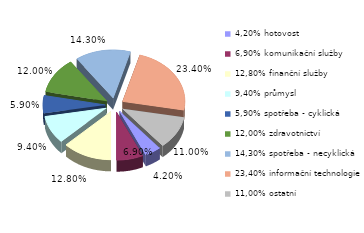
| Category | Series 0 |
|---|---|
| 4,20% hotovost | 0.042 |
| 6,90% komunikační služby | 0.069 |
| 12,80% finanční služby | 0.128 |
| 9,40% průmysl | 0.094 |
| 5,90% spotřeba - cyklická | 0.059 |
| 12,00% zdravotnictví | 0.12 |
| 14,30% spotřeba - necyklická | 0.143 |
| 23,40% informační technologie | 0.234 |
| 11,00% ostatní | 0.11 |